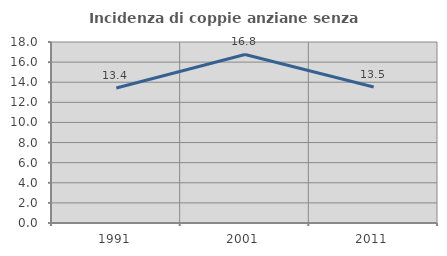
| Category | Incidenza di coppie anziane senza figli  |
|---|---|
| 1991.0 | 13.421 |
| 2001.0 | 16.763 |
| 2011.0 | 13.523 |